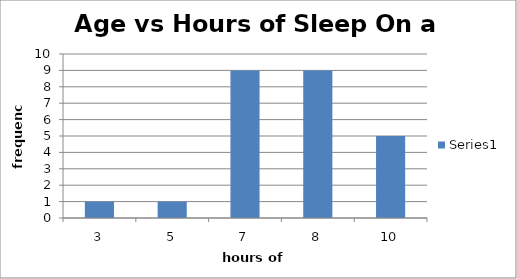
| Category | Series 0 |
|---|---|
| 3.0 | 1 |
| 5.0 | 1 |
| 7.0 | 9 |
| 8.0 | 9 |
| 10.0 | 5 |